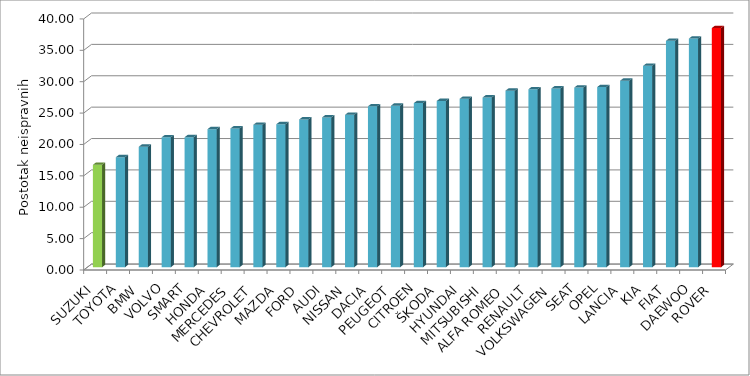
| Category | Series 4 |
|---|---|
| SUZUKI | 16.316 |
| TOYOTA | 17.524 |
| BMW | 19.19 |
| VOLVO | 20.697 |
| SMART | 20.705 |
| HONDA | 21.99 |
| MERCEDES | 22.108 |
| CHEVROLET | 22.689 |
| MAZDA | 22.775 |
| FORD | 23.543 |
| AUDI | 23.867 |
| NISSAN | 24.283 |
| DACIA | 25.631 |
| PEUGEOT | 25.728 |
| CITROEN | 26.143 |
| ŠKODA | 26.487 |
| HYUNDAI | 26.831 |
| MITSUBISHI | 27.044 |
| ALFA ROMEO | 28.126 |
| RENAULT | 28.342 |
| VOLKSWAGEN | 28.481 |
| SEAT | 28.627 |
| OPEL | 28.704 |
| LANCIA | 29.716 |
| KIA | 32.073 |
| FIAT | 36.071 |
| DAEWOO | 36.424 |
| ROVER | 38.099 |